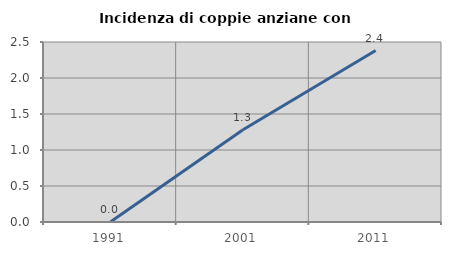
| Category | Incidenza di coppie anziane con figli |
|---|---|
| 1991.0 | 0 |
| 2001.0 | 1.282 |
| 2011.0 | 2.381 |